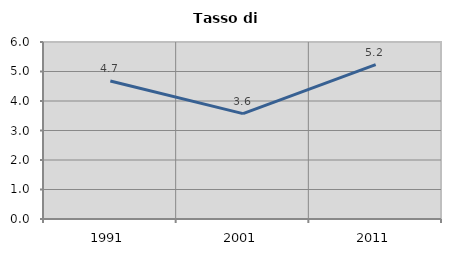
| Category | Tasso di disoccupazione   |
|---|---|
| 1991.0 | 4.68 |
| 2001.0 | 3.573 |
| 2011.0 | 5.231 |